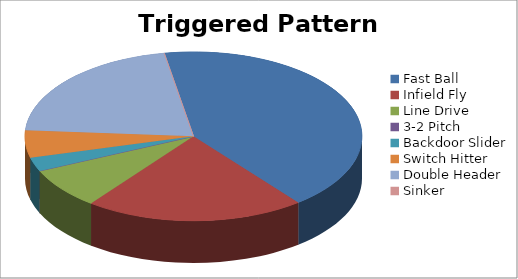
| Category | Triggered Pattern Distribution |
|---|---|
| Fast Ball | 16 |
| Infield Fly | 8 |
| Line Drive | 3 |
| 3-2 Pitch | 0 |
| Backdoor Slider | 1 |
| Switch Hitter | 2 |
| Double Header | 8 |
| Sinker | 0 |